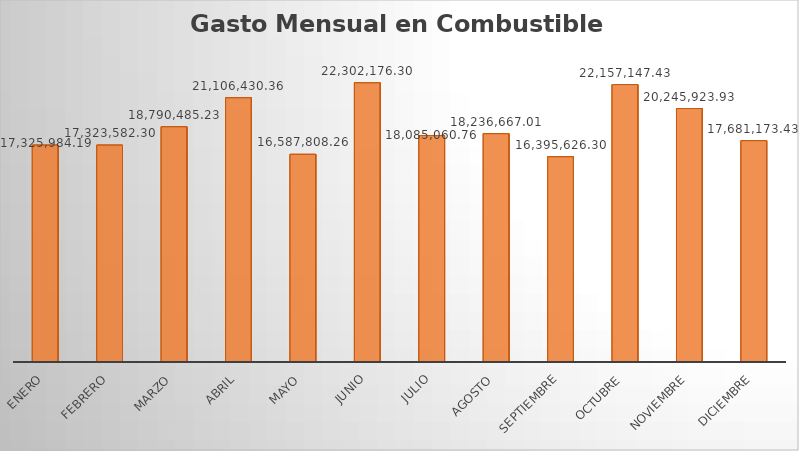
| Category | Monto |
|---|---|
| ENERO | 17325984.19 |
| FEBRERO | 17323582.3 |
| MARZO | 18790485.23 |
| ABRIL | 21106430.36 |
| MAYO | 16587808.26 |
| JUNIO | 22302176.3 |
| JULIO | 18085060.76 |
| AGOSTO | 18236667.01 |
| SEPTIEMBRE | 16395626.3 |
| OCTUBRE | 22157147.43 |
| NOVIEMBRE | 20245923.93 |
| DICIEMBRE | 17681173.43 |